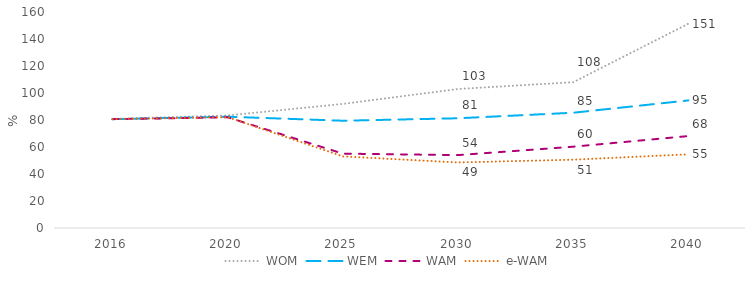
| Category | WOM | WEM | WAM | e-WAM |
|---|---|---|---|---|
| 2016.0 | 80.869 | 80.605 | 80.637 | 80.629 |
| 2020.0 | 83.378 | 82.448 | 81.983 | 82.087 |
| 2025.0 | 91.921 | 79.459 | 55.08 | 53.029 |
| 2030.0 | 102.972 | 81.286 | 53.99 | 48.549 |
| 2035.0 | 107.989 | 85.381 | 60.225 | 50.592 |
| 2040.0 | 151.344 | 94.509 | 68.103 | 54.583 |